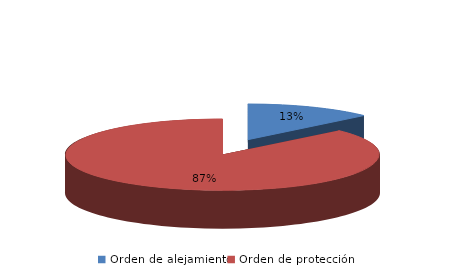
| Category | Series 0 |
|---|---|
| Orden de alejamiento | 73 |
| Orden de protección | 481 |